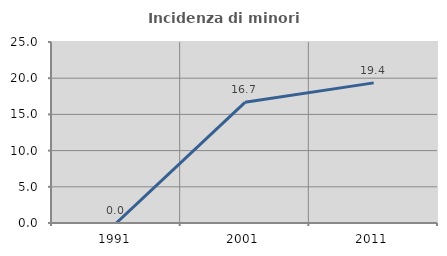
| Category | Incidenza di minori stranieri |
|---|---|
| 1991.0 | 0 |
| 2001.0 | 16.667 |
| 2011.0 | 19.355 |